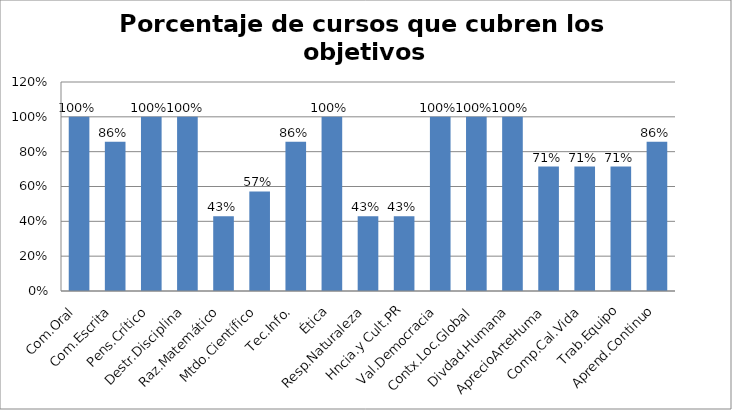
| Category | Series 0 |
|---|---|
| Com.Oral | 1 |
| Com.Escrita | 0.857 |
| Pens.Crítico | 1 |
| Destr.Disciplina | 1 |
| Raz.Matemático | 0.429 |
| Mtdo.Científico | 0.571 |
| Tec.Info. | 0.857 |
| Ética | 1 |
| Resp.Naturaleza | 0.429 |
| Hncia.y Cult.PR | 0.429 |
| Val.Democracia | 1 |
| Contx.Loc.Global | 1 |
| Divdad.Humana | 1 |
| AprecioArteHuma | 0.714 |
| Comp.Cal.Vida | 0.714 |
| Trab.Equipo | 0.714 |
| Aprend.Continuo | 0.857 |